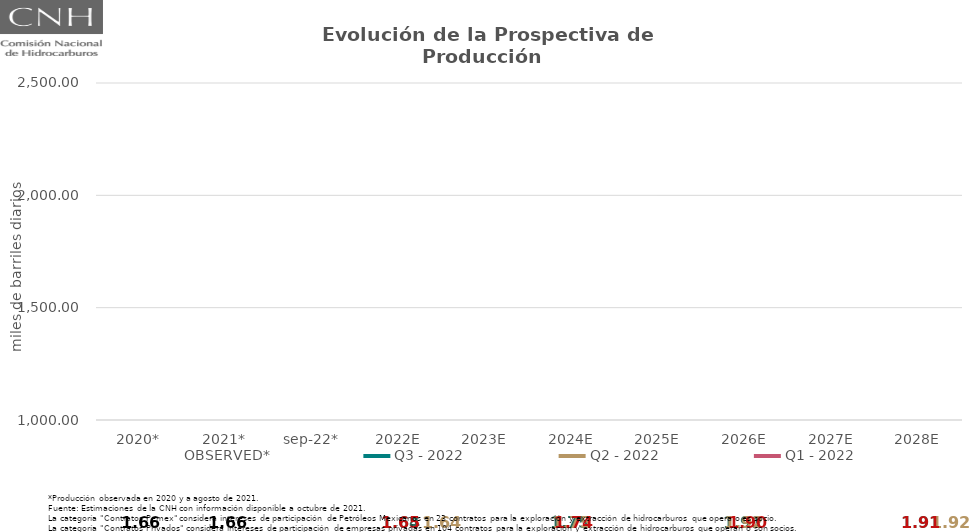
| Category | OBSERVED* | Q3 - 2022 | Q2 - 2022 | Q1 - 2022 |
|---|---|---|---|---|
| 2020* | 1.663 | 1.663 | 1.663 | 1.663 |
| 2021* | 1.665 | 1.665 | 1.665 | 1.665 |
| sep-22* | 1.625 | 1.625 | 1.625 | 1.625 |
| 2022E | 1.645 | 1.645 | 1.645 | 1.651 |
| 2023E | 1.679 | 1.679 | 1.679 | 1.685 |
| 2024E | 1.75 | 1.75 | 1.747 | 1.735 |
| 2025E | 1.81 | 1.81 | 1.808 | 1.796 |
| 2026E | 1.909 | 1.909 | 1.916 | 1.9 |
| 2027E | 1.93 | 1.93 | 1.945 | 1.928 |
| 2028E | 1.907 | 1.907 | 1.923 | 1.908 |